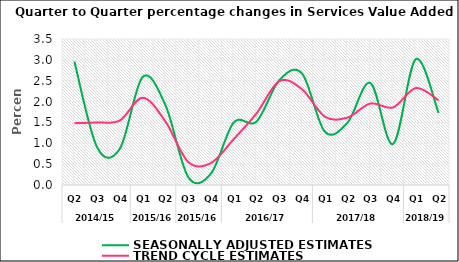
| Category | SEASONALLY ADJUSTED ESTIMATES | TREND CYCLE ESTIMATES |
|---|---|---|
| 0 | 2.961 | 1.482 |
| 1 | 0.902 | 1.5 |
| 2 | 0.873 | 1.547 |
| 3 | 2.59 | 2.091 |
| 4 | 1.914 | 1.522 |
| 5 | 0.192 | 0.553 |
| 6 | 0.274 | 0.527 |
| 7 | 1.499 | 1.1 |
| 8 | 1.519 | 1.716 |
| 9 | 2.512 | 2.489 |
| 10 | 2.674 | 2.295 |
| 11 | 1.28 | 1.639 |
| 12 | 1.496 | 1.616 |
| 13 | 2.447 | 1.953 |
| 14 | 0.983 | 1.86 |
| 15 | 3.019 | 2.324 |
| 16 | 1.726 | 2.029 |